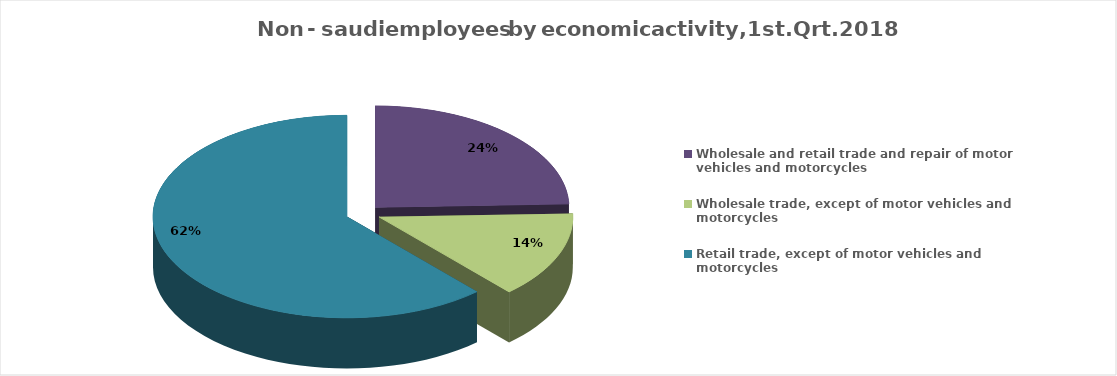
| Category | Series 0 | Series 1 |
|---|---|---|
| Wholesale and retail trade and repair of motor vehicles and motorcycles | 299775 | 12 |
| Wholesale trade, except of motor vehicles and motorcycles | 169239 | 787 |
| Retail trade, except of motor vehicles and motorcycles | 755917 | 2873 |